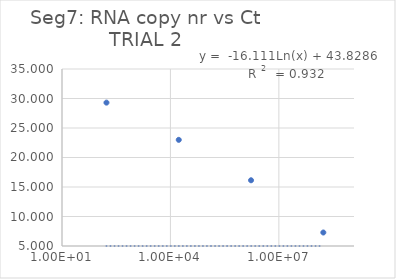
| Category | Series 0 |
|---|---|
| 170000000.0 | 7.287 |
| 1700000.0 | 16.141 |
| 17000.0 | 22.991 |
| 170.0 | 29.3 |